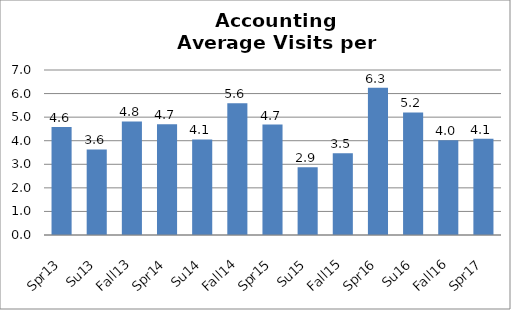
| Category | Series 0 |
|---|---|
| Spr13 | 4.578 |
| Su13 | 3.632 |
| Fall13 | 4.82 |
| Spr14 | 4.702 |
| Su14 | 4.053 |
| Fall14 | 5.592 |
| Spr15 | 4.687 |
| Su15 | 2.875 |
| Fall15 | 3.467 |
| Spr16 | 6.25 |
| Su16 | 5.2 |
| Fall16 | 4.015 |
| Spr17 | 4.086 |